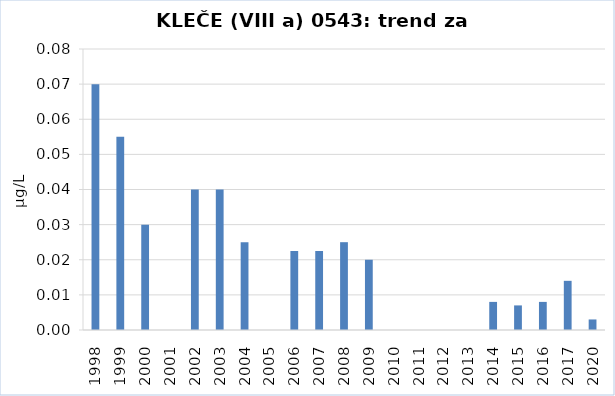
| Category | Vsota |
|---|---|
| 1998 | 0.07 |
| 1999 | 0.055 |
| 2000 | 0.03 |
| 2001 | 0 |
| 2002 | 0.04 |
| 2003 | 0.04 |
| 2004 | 0.025 |
| 2005 | 0 |
| 2006 | 0.022 |
| 2007 | 0.023 |
| 2008 | 0.025 |
| 2009 | 0.02 |
| 2010 | 0 |
| 2011 | 0 |
| 2012 | 0 |
| 2013 | 0 |
| 2014 | 0.008 |
| 2015 | 0.007 |
| 2016 | 0.008 |
| 2017 | 0.014 |
| 2020 | 0.003 |